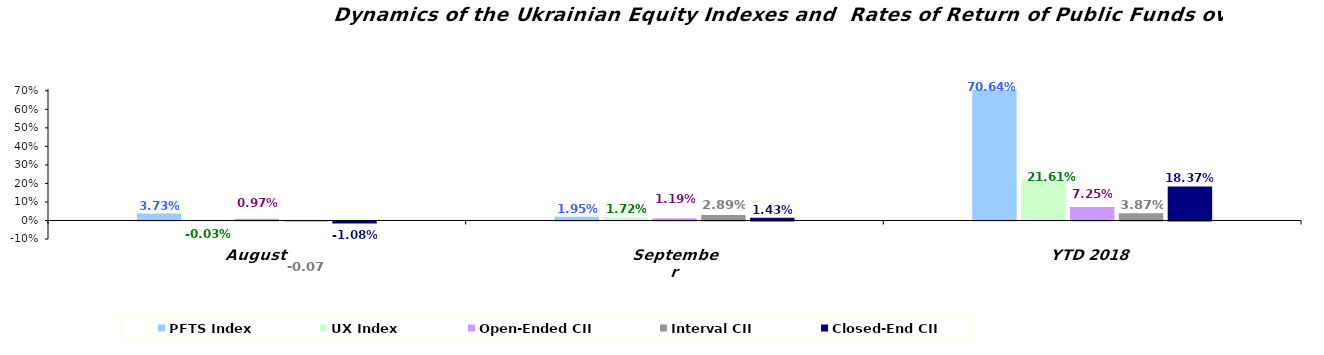
| Category | PFTS Index | UX Index | Open-Ended CII | Interval CII | Closed-End CII |
|---|---|---|---|---|---|
| August | 0.037 | 0 | 0.01 | -0.001 | -0.011 |
| September | 0.019 | 0.017 | 0.012 | 0.029 | 0.014 |
| YTD 2018 | 0.706 | 0.216 | 0.073 | 0.039 | 0.184 |